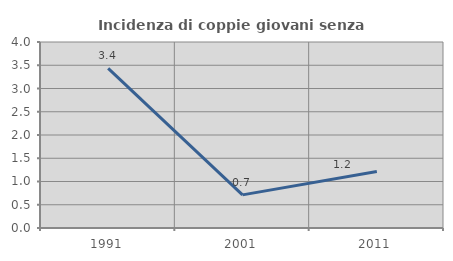
| Category | Incidenza di coppie giovani senza figli |
|---|---|
| 1991.0 | 3.432 |
| 2001.0 | 0.713 |
| 2011.0 | 1.214 |